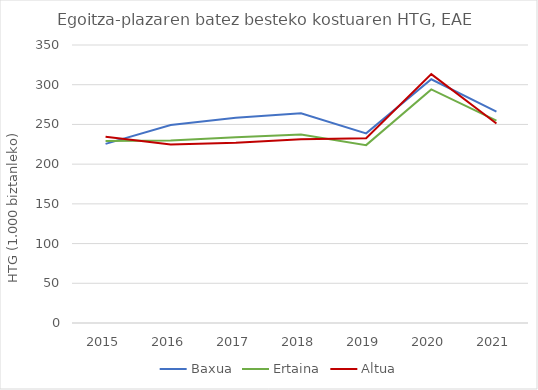
| Category | Baxua | Ertaina | Altua |
|---|---|---|---|
| 2015.0 | 225.472 | 229.029 | 234.45 |
| 2016.0 | 249.18 | 229.629 | 224.677 |
| 2017.0 | 258.393 | 233.782 | 226.912 |
| 2018.0 | 264.057 | 237.22 | 231.249 |
| 2019.0 | 238.771 | 223.935 | 232.713 |
| 2020.0 | 306.805 | 294.056 | 313.34 |
| 2021.0 | 266.011 | 254.878 | 251.132 |